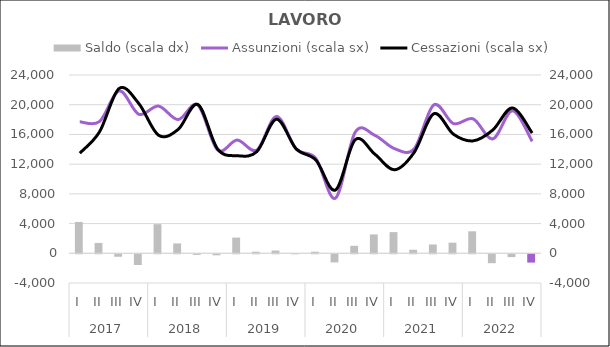
| Category | Saldo (scala dx) |
|---|---|
| 0 | 4220 |
| 1 | 1390 |
| 2 | -335 |
| 3 | -1440 |
| 4 | 3920 |
| 5 | 1330 |
| 6 | -80 |
| 7 | -135 |
| 8 | 2110 |
| 9 | 215 |
| 10 | 370 |
| 11 | -5 |
| 12 | 210 |
| 13 | -1095 |
| 14 | 1005 |
| 15 | 2535 |
| 16 | 2850 |
| 17 | 475 |
| 18 | 1185 |
| 19 | 1430 |
| 20 | 2960 |
| 21 | -1200 |
| 22 | -380 |
| 23 | -1120 |